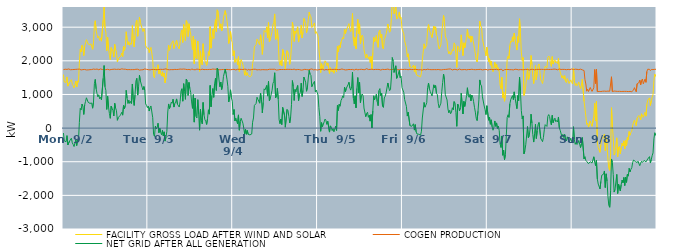
| Category | FACILITY GROSS LOAD AFTER WIND AND SOLAR | COGEN PRODUCTION | NET GRID AFTER ALL GENERATION |
|---|---|---|---|
|  Mon  9/2 | 1591 | 1738 | -147 |
|  Mon  9/2 | 1369 | 1754 | -385 |
|  Mon  9/2 | 1376 | 1750 | -374 |
|  Mon  9/2 | 1357 | 1762 | -405 |
|  Mon  9/2 | 1521 | 1745 | -224 |
|  Mon  9/2 | 1248 | 1750 | -502 |
|  Mon  9/2 | 1271 | 1758 | -487 |
|  Mon  9/2 | 1366 | 1748 | -382 |
|  Mon  9/2 | 1382 | 1735 | -353 |
|  Mon  9/2 | 1440 | 1741 | -301 |
|  Mon  9/2 | 1302 | 1739 | -437 |
|  Mon  9/2 | 1262 | 1747 | -485 |
|  Mon  9/2 | 1193 | 1742 | -549 |
|  Mon  9/2 | 1191 | 1741 | -550 |
|  Mon  9/2 | 1399 | 1746 | -347 |
|  Mon  9/2 | 1221 | 1739 | -518 |
|  Mon  9/2 | 1403 | 1750 | -347 |
|  Mon  9/2 | 1361 | 1741 | -380 |
|  Mon  9/2 | 1919 | 1753 | 166 |
|  Mon  9/2 | 2342 | 1755 | 587 |
|  Mon  9/2 | 2266 | 1729 | 537 |
|  Mon  9/2 | 2459 | 1745 | 714 |
|  Mon  9/2 | 2384 | 1739 | 645 |
|  Mon  9/2 | 2156 | 1750 | 406 |
|  Mon  9/2 | 2431 | 1743 | 688 |
|  Mon  9/2 | 2539 | 1744 | 795 |
|  Mon  9/2 | 2630 | 1729 | 901 |
|  Mon  9/2 | 2621 | 1745 | 876 |
|  Mon  9/2 | 2496 | 1731 | 765 |
|  Mon  9/2 | 2506 | 1748 | 758 |
|  Mon  9/2 | 2472 | 1737 | 735 |
|  Mon  9/2 | 2506 | 1742 | 764 |
|  Mon  9/2 | 2485 | 1740 | 745 |
|  Mon  9/2 | 2342 | 1751 | 591 |
|  Mon  9/2 | 2525 | 1755 | 770 |
|  Mon  9/2 | 3078 | 1757 | 1321 |
|  Mon  9/2 | 3192 | 1746 | 1446 |
|  Mon  9/2 | 2906 | 1740 | 1166 |
|  Mon  9/2 | 2779 | 1755 | 1024 |
|  Mon  9/2 | 2678 | 1751 | 927 |
|  Mon  9/2 | 2728 | 1734 | 994 |
|  Mon  9/2 | 2608 | 1738 | 870 |
|  Mon  9/2 | 2679 | 1760 | 919 |
|  Mon  9/2 | 2584 | 1742 | 842 |
|  Mon  9/2 | 2562 | 1741 | 821 |
|  Mon  9/2 | 3211 | 1728 | 1483 |
|  Mon  9/2 | 3599 | 1740 | 1859 |
|  Mon  9/2 | 2968 | 1742 | 1226 |
|  Mon  9/2 | 2856 | 1736 | 1120 |
|  Mon  9/2 | 2301 | 1746 | 555 |
|  Mon  9/2 | 2694 | 1749 | 945 |
|  Mon  9/2 | 2364 | 1738 | 626 |
|  Mon  9/2 | 2165 | 1731 | 434 |
|  Mon  9/2 | 2031 | 1740 | 291 |
|  Mon  9/2 | 2393 | 1741 | 652 |
|  Mon  9/2 | 2325 | 1741 | 584 |
|  Mon  9/2 | 2278 | 1748 | 530 |
|  Mon  9/2 | 2110 | 1751 | 359 |
|  Mon  9/2 | 2490 | 1752 | 738 |
|  Mon  9/2 | 2346 | 1749 | 597 |
|  Mon  9/2 | 2258 | 1744 | 514 |
|  Mon  9/2 | 1964 | 1732 | 232 |
|  Mon  9/2 | 2066 | 1751 | 315 |
|  Mon  9/2 | 2066 | 1746 | 320 |
|  Mon  9/2 | 2111 | 1742 | 369 |
|  Mon  9/2 | 2147 | 1733 | 414 |
|  Mon  9/2 | 2233 | 1762 | 471 |
|  Mon  9/2 | 2126 | 1742 | 384 |
|  Mon  9/2 | 2426 | 1751 | 675 |
|  Mon  9/2 | 2313 | 1740 | 573 |
|  Mon  9/2 | 2427 | 1751 | 676 |
|  Mon  9/2 | 2864 | 1742 | 1122 |
|  Mon  9/2 | 2625 | 1737 | 888 |
|  Mon  9/2 | 2480 | 1747 | 733 |
|  Mon  9/2 | 2568 | 1740 | 828 |
|  Mon  9/2 | 2459 | 1726 | 733 |
|  Mon  9/2 | 2531 | 1737 | 794 |
|  Mon  9/2 | 2490 | 1759 | 731 |
|  Mon  9/2 | 3050 | 1739 | 1311 |
|  Mon  9/2 | 2584 | 1741 | 843 |
|  Mon  9/2 | 2411 | 1738 | 673 |
|  Mon  9/2 | 2742 | 1749 | 993 |
|  Mon  9/2 | 3147 | 1748 | 1399 |
|  Mon  9/2 | 3208 | 1729 | 1479 |
|  Mon  9/2 | 2730 | 1749 | 981 |
|  Mon  9/2 | 2977 | 1742 | 1235 |
|  Mon  9/2 | 3298 | 1725 | 1573 |
|  Mon  9/2 | 3141 | 1737 | 1404 |
|  Mon  9/2 | 3127 | 1732 | 1395 |
|  Mon  9/2 | 2957 | 1741 | 1216 |
|  Mon  9/2 | 2868 | 1734 | 1134 |
|  Mon  9/2 | 2964 | 1727 | 1237 |
|  Mon  9/2 | 2882 | 1759 | 1123 |
|  Mon  9/2 | 2453 | 1735 | 718 |
|  Mon  9/2 | 2426 | 1747 | 679 |
|  Mon  9/2 | 2358 | 1750 | 608 |
|  Tue  9/3 | 2392 | 1737 | 655 |
|  Tue  9/3 | 2246 | 1739 | 507 |
|  Tue  9/3 | 2341 | 1731 | 610 |
|  Tue  9/3 | 2400 | 1742 | 658 |
|  Tue  9/3 | 2406 | 1743 | 663 |
|  Tue  9/3 | 2041 | 1732 | 309 |
|  Tue  9/3 | 1551 | 1743 | -192 |
|  Tue  9/3 | 1496 | 1742 | -246 |
|  Tue  9/3 | 1801 | 1741 | 60 |
|  Tue  9/3 | 1715 | 1739 | -24 |
|  Tue  9/3 | 1746 | 1735 | 11 |
|  Tue  9/3 | 1883 | 1739 | 144 |
|  Tue  9/3 | 1606 | 1743 | -137 |
|  Tue  9/3 | 1736 | 1740 | -4 |
|  Tue  9/3 | 1626 | 1748 | -122 |
|  Tue  9/3 | 1547 | 1746 | -199 |
|  Tue  9/3 | 1676 | 1743 | -67 |
|  Tue  9/3 | 1524 | 1755 | -231 |
|  Tue  9/3 | 1637 | 1749 | -112 |
|  Tue  9/3 | 1345 | 1732 | -387 |
|  Tue  9/3 | 1495 | 1761 | -266 |
|  Tue  9/3 | 1656 | 1751 | -95 |
|  Tue  9/3 | 2217 | 1738 | 479 |
|  Tue  9/3 | 2467 | 1749 | 718 |
|  Tue  9/3 | 2314 | 1734 | 580 |
|  Tue  9/3 | 2413 | 1751 | 662 |
|  Tue  9/3 | 2510 | 1739 | 771 |
|  Tue  9/3 | 2482 | 1744 | 738 |
|  Tue  9/3 | 2596 | 1737 | 859 |
|  Tue  9/3 | 2363 | 1738 | 625 |
|  Tue  9/3 | 2474 | 1745 | 729 |
|  Tue  9/3 | 2531 | 1750 | 781 |
|  Tue  9/3 | 2609 | 1741 | 868 |
|  Tue  9/3 | 2452 | 1744 | 708 |
|  Tue  9/3 | 2429 | 1745 | 684 |
|  Tue  9/3 | 2356 | 1730 | 626 |
|  Tue  9/3 | 2545 | 1755 | 790 |
|  Tue  9/3 | 2841 | 1745 | 1096 |
|  Tue  9/3 | 2920 | 1750 | 1170 |
|  Tue  9/3 | 2547 | 1747 | 800 |
|  Tue  9/3 | 3077 | 1756 | 1321 |
|  Tue  9/3 | 2843 | 1747 | 1096 |
|  Tue  9/3 | 2604 | 1749 | 855 |
|  Tue  9/3 | 3195 | 1743 | 1452 |
|  Tue  9/3 | 3133 | 1738 | 1395 |
|  Tue  9/3 | 2720 | 1751 | 969 |
|  Tue  9/3 | 3102 | 1744 | 1358 |
|  Tue  9/3 | 2913 | 1740 | 1173 |
|  Tue  9/3 | 2785 | 1729 | 1056 |
|  Tue  9/3 | 2537 | 1760 | 777 |
|  Tue  9/3 | 2332 | 1745 | 587 |
|  Tue  9/3 | 2735 | 1740 | 995 |
|  Tue  9/3 | 1914 | 1737 | 177 |
|  Tue  9/3 | 2627 | 1733 | 894 |
|  Tue  9/3 | 2088 | 1740 | 348 |
|  Tue  9/3 | 2055 | 1754 | 301 |
|  Tue  9/3 | 2588 | 1743 | 845 |
|  Tue  9/3 | 2167 | 1746 | 421 |
|  Tue  9/3 | 1685 | 1748 | -63 |
|  Tue  9/3 | 2295 | 1736 | 559 |
|  Tue  9/3 | 1965 | 1742 | 223 |
|  Tue  9/3 | 1878 | 1752 | 126 |
|  Tue  9/3 | 2508 | 1746 | 762 |
|  Tue  9/3 | 2134 | 1738 | 396 |
|  Tue  9/3 | 2002 | 1749 | 253 |
|  Tue  9/3 | 1941 | 1741 | 200 |
|  Tue  9/3 | 1864 | 1756 | 108 |
|  Tue  9/3 | 2020 | 1740 | 280 |
|  Tue  9/3 | 2272 | 1728 | 544 |
|  Tue  9/3 | 2159 | 1745 | 414 |
|  Tue  9/3 | 3015 | 1746 | 1269 |
|  Tue  9/3 | 2375 | 1742 | 633 |
|  Tue  9/3 | 2706 | 1738 | 968 |
|  Tue  9/3 | 2931 | 1755 | 1176 |
|  Tue  9/3 | 2665 | 1750 | 915 |
|  Tue  9/3 | 3064 | 1750 | 1314 |
|  Tue  9/3 | 3224 | 1743 | 1481 |
|  Tue  9/3 | 2869 | 1748 | 1121 |
|  Tue  9/3 | 3515 | 1735 | 1780 |
|  Tue  9/3 | 3460 | 1742 | 1718 |
|  Tue  9/3 | 3176 | 1745 | 1431 |
|  Tue  9/3 | 2963 | 1733 | 1230 |
|  Tue  9/3 | 3099 | 1731 | 1368 |
|  Tue  9/3 | 2886 | 1740 | 1146 |
|  Tue  9/3 | 2998 | 1731 | 1267 |
|  Tue  9/3 | 3273 | 1742 | 1531 |
|  Tue  9/3 | 3297 | 1744 | 1553 |
|  Tue  9/3 | 3493 | 1742 | 1751 |
|  Tue  9/3 | 3362 | 1743 | 1619 |
|  Tue  9/3 | 3197 | 1744 | 1453 |
|  Tue  9/3 | 2979 | 1738 | 1241 |
|  Tue  9/3 | 2515 | 1739 | 776 |
|  Tue  9/3 | 2670 | 1745 | 925 |
|  Tue  9/3 | 2872 | 1734 | 1138 |
|  Tue  9/3 | 2635 | 1733 | 902 |
|  Tue  9/3 | 2543 | 1742 | 801 |
|  Wed  9/4 | 2151 | 1747 | 404 |
|  Wed  9/4 | 2299 | 1748 | 551 |
|  Wed  9/4 | 1956 | 1743 | 213 |
|  Wed  9/4 | 2022 | 1728 | 294 |
|  Wed  9/4 | 2062 | 1756 | 306 |
|  Wed  9/4 | 1876 | 1748 | 128 |
|  Wed  9/4 | 2128 | 1736 | 392 |
|  Wed  9/4 | 1683 | 1747 | -64 |
|  Wed  9/4 | 1943 | 1747 | 196 |
|  Wed  9/4 | 2039 | 1746 | 293 |
|  Wed  9/4 | 2065 | 1749 | 316 |
|  Wed  9/4 | 1888 | 1741 | 147 |
|  Wed  9/4 | 1746 | 1744 | 2 |
|  Wed  9/4 | 1574 | 1751 | -177 |
|  Wed  9/4 | 1713 | 1749 | -36 |
|  Wed  9/4 | 1563 | 1747 | -184 |
|  Wed  9/4 | 1645 | 1716 | -71 |
|  Wed  9/4 | 1563 | 1749 | -186 |
|  Wed  9/4 | 1554 | 1757 | -203 |
|  Wed  9/4 | 1524 | 1727 | -203 |
|  Wed  9/4 | 1537 | 1749 | -212 |
|  Wed  9/4 | 1568 | 1742 | -174 |
|  Wed  9/4 | 1922 | 1748 | 174 |
|  Wed  9/4 | 2049 | 1748 | 301 |
|  Wed  9/4 | 2415 | 1742 | 673 |
|  Wed  9/4 | 2432 | 1750 | 682 |
|  Wed  9/4 | 2485 | 1751 | 734 |
|  Wed  9/4 | 2647 | 1729 | 918 |
|  Wed  9/4 | 2590 | 1734 | 856 |
|  Wed  9/4 | 2600 | 1737 | 863 |
|  Wed  9/4 | 2478 | 1738 | 740 |
|  Wed  9/4 | 2774 | 1731 | 1043 |
|  Wed  9/4 | 2593 | 1749 | 844 |
|  Wed  9/4 | 2191 | 1738 | 453 |
|  Wed  9/4 | 2499 | 1734 | 765 |
|  Wed  9/4 | 2903 | 1736 | 1167 |
|  Wed  9/4 | 2880 | 1746 | 1134 |
|  Wed  9/4 | 2849 | 1734 | 1115 |
|  Wed  9/4 | 3010 | 1742 | 1268 |
|  Wed  9/4 | 2685 | 1734 | 951 |
|  Wed  9/4 | 3138 | 1752 | 1386 |
|  Wed  9/4 | 2562 | 1749 | 813 |
|  Wed  9/4 | 2630 | 1745 | 885 |
|  Wed  9/4 | 2635 | 1748 | 887 |
|  Wed  9/4 | 2866 | 1743 | 1123 |
|  Wed  9/4 | 3075 | 1748 | 1327 |
|  Wed  9/4 | 3143 | 1753 | 1390 |
|  Wed  9/4 | 3394 | 1749 | 1645 |
|  Wed  9/4 | 2633 | 1734 | 899 |
|  Wed  9/4 | 2675 | 1725 | 950 |
|  Wed  9/4 | 2927 | 1744 | 1183 |
|  Wed  9/4 | 2592 | 1732 | 860 |
|  Wed  9/4 | 1988 | 1741 | 247 |
|  Wed  9/4 | 1872 | 1741 | 131 |
|  Wed  9/4 | 2006 | 1739 | 267 |
|  Wed  9/4 | 1847 | 1742 | 105 |
|  Wed  9/4 | 2337 | 1722 | 615 |
|  Wed  9/4 | 2337 | 1742 | 595 |
|  Wed  9/4 | 2137 | 1747 | 390 |
|  Wed  9/4 | 1766 | 1740 | 26 |
|  Wed  9/4 | 1784 | 1748 | 36 |
|  Wed  9/4 | 2302 | 1748 | 554 |
|  Wed  9/4 | 2261 | 1738 | 523 |
|  Wed  9/4 | 2096 | 1746 | 350 |
|  Wed  9/4 | 1894 | 1741 | 153 |
|  Wed  9/4 | 2073 | 1746 | 327 |
|  Wed  9/4 | 2441 | 1745 | 696 |
|  Wed  9/4 | 3154 | 1741 | 1413 |
|  Wed  9/4 | 2985 | 1751 | 1234 |
|  Wed  9/4 | 2574 | 1753 | 821 |
|  Wed  9/4 | 2888 | 1741 | 1147 |
|  Wed  9/4 | 2814 | 1732 | 1082 |
|  Wed  9/4 | 2929 | 1731 | 1198 |
|  Wed  9/4 | 3012 | 1744 | 1268 |
|  Wed  9/4 | 2558 | 1744 | 814 |
|  Wed  9/4 | 2742 | 1740 | 1002 |
|  Wed  9/4 | 2803 | 1743 | 1060 |
|  Wed  9/4 | 3059 | 1724 | 1335 |
|  Wed  9/4 | 2678 | 1737 | 941 |
|  Wed  9/4 | 2852 | 1731 | 1121 |
|  Wed  9/4 | 3262 | 1746 | 1516 |
|  Wed  9/4 | 3187 | 1747 | 1440 |
|  Wed  9/4 | 3104 | 1739 | 1365 |
|  Wed  9/4 | 2834 | 1739 | 1095 |
|  Wed  9/4 | 2954 | 1739 | 1215 |
|  Wed  9/4 | 3222 | 1732 | 1490 |
|  Wed  9/4 | 3446 | 1729 | 1717 |
|  Wed  9/4 | 3344 | 1746 | 1598 |
|  Wed  9/4 | 3308 | 1744 | 1564 |
|  Wed  9/4 | 2990 | 1759 | 1231 |
|  Wed  9/4 | 3029 | 1733 | 1296 |
|  Wed  9/4 | 3013 | 1731 | 1282 |
|  Wed  9/4 | 3127 | 1738 | 1389 |
|  Wed  9/4 | 2814 | 1739 | 1075 |
|  Wed  9/4 | 2868 | 1738 | 1130 |
|  Wed  9/4 | 2860 | 1726 | 1134 |
|  Thu  9/5 | 2737 | 1750 | 987 |
|  Thu  9/5 | 2345 | 1737 | 608 |
|  Thu  9/5 | 2076 | 1738 | 338 |
|  Thu  9/5 | 1650 | 1745 | -95 |
|  Thu  9/5 | 1915 | 1752 | 163 |
|  Thu  9/5 | 1787 | 1749 | 38 |
|  Thu  9/5 | 1750 | 1739 | 11 |
|  Thu  9/5 | 1914 | 1726 | 188 |
|  Thu  9/5 | 2000 | 1732 | 268 |
|  Thu  9/5 | 1964 | 1741 | 223 |
|  Thu  9/5 | 1852 | 1740 | 112 |
|  Thu  9/5 | 1935 | 1733 | 202 |
|  Thu  9/5 | 1922 | 1740 | 182 |
|  Thu  9/5 | 1627 | 1746 | -119 |
|  Thu  9/5 | 1797 | 1730 | 67 |
|  Thu  9/5 | 1773 | 1745 | 28 |
|  Thu  9/5 | 1667 | 1742 | -75 |
|  Thu  9/5 | 1734 | 1745 | -11 |
|  Thu  9/5 | 1627 | 1739 | -112 |
|  Thu  9/5 | 1648 | 1746 | -98 |
|  Thu  9/5 | 1796 | 1739 | 57 |
|  Thu  9/5 | 1675 | 1744 | -69 |
|  Thu  9/5 | 2426 | 1751 | 675 |
|  Thu  9/5 | 2263 | 1739 | 524 |
|  Thu  9/5 | 2458 | 1746 | 712 |
|  Thu  9/5 | 2390 | 1741 | 649 |
|  Thu  9/5 | 2560 | 1745 | 815 |
|  Thu  9/5 | 2632 | 1758 | 874 |
|  Thu  9/5 | 2692 | 1734 | 958 |
|  Thu  9/5 | 2650 | 1742 | 908 |
|  Thu  9/5 | 2946 | 1727 | 1219 |
|  Thu  9/5 | 2811 | 1729 | 1082 |
|  Thu  9/5 | 2915 | 1732 | 1183 |
|  Thu  9/5 | 2914 | 1734 | 1180 |
|  Thu  9/5 | 3042 | 1750 | 1292 |
|  Thu  9/5 | 3105 | 1743 | 1362 |
|  Thu  9/5 | 2940 | 1743 | 1197 |
|  Thu  9/5 | 2869 | 1740 | 1129 |
|  Thu  9/5 | 2967 | 1743 | 1224 |
|  Thu  9/5 | 3407 | 1744 | 1663 |
|  Thu  9/5 | 2639 | 1750 | 889 |
|  Thu  9/5 | 2448 | 1727 | 721 |
|  Thu  9/5 | 2695 | 1736 | 959 |
|  Thu  9/5 | 2355 | 1752 | 603 |
|  Thu  9/5 | 2921 | 1739 | 1182 |
|  Thu  9/5 | 3236 | 1733 | 1503 |
|  Thu  9/5 | 2811 | 1760 | 1051 |
|  Thu  9/5 | 3101 | 1743 | 1358 |
|  Thu  9/5 | 2501 | 1743 | 758 |
|  Thu  9/5 | 2709 | 1748 | 961 |
|  Thu  9/5 | 2766 | 1753 | 1013 |
|  Thu  9/5 | 2695 | 1739 | 956 |
|  Thu  9/5 | 2333 | 1735 | 598 |
|  Thu  9/5 | 2324 | 1738 | 586 |
|  Thu  9/5 | 2080 | 1740 | 340 |
|  Thu  9/5 | 2199 | 1766 | 433 |
|  Thu  9/5 | 2222 | 1750 | 472 |
|  Thu  9/5 | 2061 | 1741 | 320 |
|  Thu  9/5 | 2123 | 1735 | 388 |
|  Thu  9/5 | 1951 | 1744 | 207 |
|  Thu  9/5 | 2131 | 1729 | 402 |
|  Thu  9/5 | 1755 | 1751 | 4 |
|  Thu  9/5 | 2246 | 1733 | 513 |
|  Thu  9/5 | 2698 | 1738 | 960 |
|  Thu  9/5 | 2568 | 1728 | 840 |
|  Thu  9/5 | 2656 | 1745 | 911 |
|  Thu  9/5 | 2750 | 1746 | 1004 |
|  Thu  9/5 | 2530 | 1745 | 785 |
|  Thu  9/5 | 2400 | 1734 | 666 |
|  Thu  9/5 | 2859 | 1744 | 1115 |
|  Thu  9/5 | 2916 | 1742 | 1174 |
|  Thu  9/5 | 2686 | 1726 | 960 |
|  Thu  9/5 | 2783 | 1751 | 1032 |
|  Thu  9/5 | 2397 | 1747 | 650 |
|  Thu  9/5 | 2351 | 1738 | 613 |
|  Thu  9/5 | 2637 | 1741 | 896 |
|  Thu  9/5 | 2700 | 1751 | 949 |
|  Thu  9/5 | 2789 | 1744 | 1045 |
|  Thu  9/5 | 2763 | 1721 | 1042 |
|  Thu  9/5 | 3095 | 1754 | 1341 |
|  Thu  9/5 | 2950 | 1742 | 1208 |
|  Thu  9/5 | 2849 | 1736 | 1113 |
|  Thu  9/5 | 2890 | 1747 | 1143 |
|  Thu  9/5 | 3262 | 1743 | 1519 |
|  Thu  9/5 | 3851 | 1754 | 2097 |
|  Thu  9/5 | 3737 | 1744 | 1993 |
|  Thu  9/5 | 3402 | 1748 | 1654 |
|  Thu  9/5 | 3514 | 1751 | 1763 |
|  Thu  9/5 | 3601 | 1748 | 1853 |
|  Thu  9/5 | 3240 | 1761 | 1479 |
|  Thu  9/5 | 3274 | 1730 | 1544 |
|  Thu  9/5 | 3254 | 1728 | 1526 |
|  Thu  9/5 | 3452 | 1737 | 1715 |
|  Thu  9/5 | 3253 | 1756 | 1497 |
|  Thu  9/5 | 3291 | 1749 | 1542 |
|  Thu  9/5 | 2956 | 1754 | 1202 |
|  Fri  9/6 | 2947 | 1740 | 1207 |
|  Fri  9/6 | 2805 | 1742 | 1063 |
|  Fri  9/6 | 2596 | 1747 | 849 |
|  Fri  9/6 | 2586 | 1747 | 839 |
|  Fri  9/6 | 2389 | 1744 | 645 |
|  Fri  9/6 | 2111 | 1754 | 357 |
|  Fri  9/6 | 2209 | 1736 | 473 |
|  Fri  9/6 | 2183 | 1738 | 445 |
|  Fri  9/6 | 1822 | 1749 | 73 |
|  Fri  9/6 | 1839 | 1740 | 99 |
|  Fri  9/6 | 1793 | 1740 | 53 |
|  Fri  9/6 | 1781 | 1741 | 40 |
|  Fri  9/6 | 1871 | 1742 | 129 |
|  Fri  9/6 | 1679 | 1739 | -60 |
|  Fri  9/6 | 1851 | 1748 | 103 |
|  Fri  9/6 | 1618 | 1730 | -112 |
|  Fri  9/6 | 1563 | 1740 | -177 |
|  Fri  9/6 | 1546 | 1745 | -199 |
|  Fri  9/6 | 1549 | 1733 | -184 |
|  Fri  9/6 | 1549 | 1740 | -191 |
|  Fri  9/6 | 1524 | 1736 | -212 |
|  Fri  9/6 | 1645 | 1738 | -93 |
|  Fri  9/6 | 2026 | 1726 | 300 |
|  Fri  9/6 | 2026 | 1735 | 291 |
|  Fri  9/6 | 2504 | 1743 | 761 |
|  Fri  9/6 | 2368 | 1747 | 621 |
|  Fri  9/6 | 2415 | 1734 | 681 |
|  Fri  9/6 | 2487 | 1733 | 754 |
|  Fri  9/6 | 2954 | 1752 | 1202 |
|  Fri  9/6 | 3077 | 1738 | 1339 |
|  Fri  9/6 | 2910 | 1741 | 1169 |
|  Fri  9/6 | 2844 | 1757 | 1087 |
|  Fri  9/6 | 2822 | 1737 | 1085 |
|  Fri  9/6 | 2690 | 1737 | 953 |
|  Fri  9/6 | 2684 | 1738 | 946 |
|  Fri  9/6 | 3031 | 1745 | 1286 |
|  Fri  9/6 | 2936 | 1739 | 1197 |
|  Fri  9/6 | 3011 | 1745 | 1266 |
|  Fri  9/6 | 2766 | 1737 | 1029 |
|  Fri  9/6 | 2728 | 1733 | 995 |
|  Fri  9/6 | 2483 | 1743 | 740 |
|  Fri  9/6 | 2351 | 1748 | 603 |
|  Fri  9/6 | 2344 | 1733 | 611 |
|  Fri  9/6 | 2474 | 1733 | 741 |
|  Fri  9/6 | 2812 | 1732 | 1080 |
|  Fri  9/6 | 3094 | 1744 | 1350 |
|  Fri  9/6 | 3349 | 1742 | 1607 |
|  Fri  9/6 | 3180 | 1744 | 1436 |
|  Fri  9/6 | 2738 | 1743 | 995 |
|  Fri  9/6 | 2742 | 1751 | 991 |
|  Fri  9/6 | 2584 | 1748 | 836 |
|  Fri  9/6 | 2309 | 1740 | 569 |
|  Fri  9/6 | 2207 | 1756 | 451 |
|  Fri  9/6 | 2276 | 1746 | 530 |
|  Fri  9/6 | 2183 | 1757 | 426 |
|  Fri  9/6 | 2222 | 1747 | 475 |
|  Fri  9/6 | 2335 | 1729 | 606 |
|  Fri  9/6 | 2293 | 1748 | 545 |
|  Fri  9/6 | 2534 | 1745 | 789 |
|  Fri  9/6 | 2489 | 1745 | 744 |
|  Fri  9/6 | 2210 | 1742 | 468 |
|  Fri  9/6 | 1804 | 1752 | 52 |
|  Fri  9/6 | 2442 | 1728 | 714 |
|  Fri  9/6 | 2400 | 1754 | 646 |
|  Fri  9/6 | 2267 | 1756 | 511 |
|  Fri  9/6 | 2335 | 1736 | 599 |
|  Fri  9/6 | 2772 | 1735 | 1037 |
|  Fri  9/6 | 2766 | 1747 | 1019 |
|  Fri  9/6 | 2158 | 1737 | 421 |
|  Fri  9/6 | 2536 | 1741 | 795 |
|  Fri  9/6 | 2385 | 1742 | 643 |
|  Fri  9/6 | 2526 | 1744 | 782 |
|  Fri  9/6 | 2695 | 1732 | 963 |
|  Fri  9/6 | 2939 | 1740 | 1199 |
|  Fri  9/6 | 2704 | 1742 | 962 |
|  Fri  9/6 | 2662 | 1748 | 914 |
|  Fri  9/6 | 2742 | 1741 | 1001 |
|  Fri  9/6 | 2555 | 1746 | 809 |
|  Fri  9/6 | 2733 | 1749 | 984 |
|  Fri  9/6 | 2660 | 1739 | 921 |
|  Fri  9/6 | 2530 | 1740 | 790 |
|  Fri  9/6 | 2362 | 1743 | 619 |
|  Fri  9/6 | 2210 | 1736 | 474 |
|  Fri  9/6 | 2034 | 1745 | 289 |
|  Fri  9/6 | 1964 | 1740 | 224 |
|  Fri  9/6 | 2238 | 1737 | 501 |
|  Fri  9/6 | 2586 | 1743 | 843 |
|  Fri  9/6 | 3181 | 1749 | 1432 |
|  Fri  9/6 | 3039 | 1746 | 1293 |
|  Fri  9/6 | 3003 | 1748 | 1255 |
|  Fri  9/6 | 2659 | 1730 | 929 |
|  Fri  9/6 | 2648 | 1745 | 903 |
|  Fri  9/6 | 2395 | 1738 | 657 |
|  Fri  9/6 | 2294 | 1744 | 550 |
|  Fri  9/6 | 2148 | 1746 | 402 |
|  Fri  9/6 | 2405 | 1740 | 665 |
|  Sat  9/7 | 2392 | 1726 | 666 |
|  Sat  9/7 | 1974 | 1740 | 234 |
|  Sat  9/7 | 2068 | 1741 | 327 |
|  Sat  9/7 | 1870 | 1756 | 114 |
|  Sat  9/7 | 1990 | 1744 | 246 |
|  Sat  9/7 | 1768 | 1730 | 38 |
|  Sat  9/7 | 1674 | 1738 | -64 |
|  Sat  9/7 | 1769 | 1742 | 27 |
|  Sat  9/7 | 1953 | 1741 | 212 |
|  Sat  9/7 | 1795 | 1742 | 53 |
|  Sat  9/7 | 1901 | 1747 | 154 |
|  Sat  9/7 | 1724 | 1734 | -10 |
|  Sat  9/7 | 1793 | 1734 | 59 |
|  Sat  9/7 | 1668 | 1744 | -76 |
|  Sat  9/7 | 1278 | 1745 | -467 |
|  Sat  9/7 | 1171 | 1748 | -577 |
|  Sat  9/7 | 1512 | 1746 | -234 |
|  Sat  9/7 | 896 | 1704 | -808 |
|  Sat  9/7 | 1076 | 1732 | -656 |
|  Sat  9/7 | 799 | 1738 | -939 |
|  Sat  9/7 | 965 | 1751 | -786 |
|  Sat  9/7 | 1506 | 1742 | -236 |
|  Sat  9/7 | 2045 | 1727 | 318 |
|  Sat  9/7 | 2140 | 1743 | 397 |
|  Sat  9/7 | 2069 | 1751 | 318 |
|  Sat  9/7 | 2452 | 1736 | 716 |
|  Sat  9/7 | 2589 | 1744 | 845 |
|  Sat  9/7 | 2553 | 1737 | 816 |
|  Sat  9/7 | 2713 | 1748 | 965 |
|  Sat  9/7 | 2576 | 1729 | 847 |
|  Sat  9/7 | 2824 | 1747 | 1077 |
|  Sat  9/7 | 2640 | 1750 | 890 |
|  Sat  9/7 | 2457 | 1732 | 725 |
|  Sat  9/7 | 2320 | 1743 | 577 |
|  Sat  9/7 | 2723 | 1756 | 967 |
|  Sat  9/7 | 2548 | 1731 | 817 |
|  Sat  9/7 | 3250 | 1738 | 1512 |
|  Sat  9/7 | 2845 | 1740 | 1105 |
|  Sat  9/7 | 2258 | 1738 | 520 |
|  Sat  9/7 | 2013 | 1735 | 278 |
|  Sat  9/7 | 2097 | 1735 | 362 |
|  Sat  9/7 | 971 | 1735 | -764 |
|  Sat  9/7 | 1068 | 1746 | -678 |
|  Sat  9/7 | 1249 | 1746 | -497 |
|  Sat  9/7 | 1257 | 1737 | -480 |
|  Sat  9/7 | 1787 | 1742 | 45 |
|  Sat  9/7 | 1448 | 1730 | -282 |
|  Sat  9/7 | 1507 | 1728 | -221 |
|  Sat  9/7 | 1753 | 1751 | 2 |
|  Sat  9/7 | 2158 | 1745 | 413 |
|  Sat  9/7 | 1892 | 1745 | 147 |
|  Sat  9/7 | 1550 | 1746 | -196 |
|  Sat  9/7 | 1324 | 1739 | -415 |
|  Sat  9/7 | 1567 | 1732 | -165 |
|  Sat  9/7 | 1855 | 1742 | 113 |
|  Sat  9/7 | 1435 | 1744 | -309 |
|  Sat  9/7 | 1679 | 1754 | -75 |
|  Sat  9/7 | 1852 | 1745 | 107 |
|  Sat  9/7 | 1907 | 1740 | 167 |
|  Sat  9/7 | 1935 | 1745 | 190 |
|  Sat  9/7 | 1439 | 1748 | -309 |
|  Sat  9/7 | 1394 | 1747 | -353 |
|  Sat  9/7 | 1326 | 1730 | -404 |
|  Sat  9/7 | 1461 | 1744 | -283 |
|  Sat  9/7 | 1694 | 1743 | -49 |
|  Sat  9/7 | 1838 | 1736 | 102 |
|  Sat  9/7 | 1831 | 1727 | 104 |
|  Sat  9/7 | 1797 | 1748 | 49 |
|  Sat  9/7 | 2091 | 1740 | 351 |
|  Sat  9/7 | 2143 | 1741 | 402 |
|  Sat  9/7 | 2097 | 1753 | 344 |
|  Sat  9/7 | 1916 | 1744 | 172 |
|  Sat  9/7 | 1835 | 1738 | 97 |
|  Sat  9/7 | 2125 | 1746 | 379 |
|  Sat  9/7 | 1904 | 1742 | 162 |
|  Sat  9/7 | 1997 | 1754 | 243 |
|  Sat  9/7 | 2031 | 1736 | 295 |
|  Sat  9/7 | 1939 | 1749 | 190 |
|  Sat  9/7 | 1972 | 1748 | 224 |
|  Sat  9/7 | 1916 | 1733 | 183 |
|  Sat  9/7 | 2080 | 1750 | 330 |
|  Sat  9/7 | 1764 | 1757 | 7 |
|  Sat  9/7 | 1666 | 1734 | -68 |
|  Sat  9/7 | 1685 | 1743 | -58 |
|  Sat  9/7 | 1488 | 1750 | -262 |
|  Sat  9/7 | 1560 | 1746 | -186 |
|  Sat  9/7 | 1458 | 1739 | -281 |
|  Sat  9/7 | 1557 | 1744 | -187 |
|  Sat  9/7 | 1392 | 1737 | -345 |
|  Sat  9/7 | 1352 | 1736 | -384 |
|  Sat  9/7 | 1473 | 1732 | -259 |
|  Sat  9/7 | 1409 | 1746 | -337 |
|  Sat  9/7 | 1326 | 1743 | -417 |
|  Sat  9/7 | 1371 | 1738 | -367 |
|  Sat  9/7 | 1434 | 1736 | -302 |
|  Sat  9/7 | 1351 | 1757 | -406 |
|  Sun  9/8 | 1310 | 1750 | -440 |
|  Sun  9/8 | 1782 | 1741 | 41 |
|  Sun  9/8 | 1414 | 1753 | -339 |
|  Sun  9/8 | 1267 | 1750 | -483 |
|  Sun  9/8 | 1328 | 1750 | -422 |
|  Sun  9/8 | 1258 | 1747 | -489 |
|  Sun  9/8 | 1295 | 1744 | -449 |
|  Sun  9/8 | 1371 | 1738 | -367 |
|  Sun  9/8 | 1260 | 1735 | -475 |
|  Sun  9/8 | 1173 | 1752 | -579 |
|  Sun  9/8 | 1277 | 1742 | -465 |
|  Sun  9/8 | 1452 | 1731 | -279 |
|  Sun  9/8 | 1458 | 1738 | -280 |
|  Sun  9/8 | 794 | 1710 | -916 |
|  Sun  9/8 | 585 | 1437 | -852 |
|  Sun  9/8 | 351 | 1312 | -961 |
|  Sun  9/8 | 106 | 1097 | -991 |
|  Sun  9/8 | 149 | 1155 | -1006 |
|  Sun  9/8 | 29 | 1088 | -1059 |
|  Sun  9/8 | 55 | 1089 | -1034 |
|  Sun  9/8 | 205 | 1206 | -1001 |
|  Sun  9/8 | 129 | 1146 | -1017 |
|  Sun  9/8 | 52 | 1091 | -1039 |
|  Sun  9/8 | 72 | 1096 | -1024 |
|  Sun  9/8 | 345 | 1198 | -853 |
|  Sun  9/8 | 736 | 1740 | -1004 |
|  Sun  9/8 | 212 | 1327 | -1115 |
|  Sun  9/8 | 791 | 1745 | -954 |
|  Sun  9/8 | -431 | 1085 | -1516 |
|  Sun  9/8 | -587 | 1076 | -1663 |
|  Sun  9/8 | -597 | 1091 | -1688 |
|  Sun  9/8 | -721 | 1088 | -1809 |
|  Sun  9/8 | -498 | 1087 | -1585 |
|  Sun  9/8 | -306 | 1095 | -1401 |
|  Sun  9/8 | -323 | 1096 | -1419 |
|  Sun  9/8 | -280 | 1091 | -1371 |
|  Sun  9/8 | -176 | 1099 | -1275 |
|  Sun  9/8 | -670 | 1098 | -1768 |
|  Sun  9/8 | -266 | 1093 | -1359 |
|  Sun  9/8 | -492 | 1085 | -1577 |
|  Sun  9/8 | -935 | 1100 | -2035 |
|  Sun  9/8 | -1198 | 1102 | -2300 |
|  Sun  9/8 | -1260 | 1094 | -2354 |
|  Sun  9/8 | -769 | 1095 | -1864 |
|  Sun  9/8 | 607 | 1525 | -918 |
|  Sun  9/8 | 67 | 1085 | -1018 |
|  Sun  9/8 | -284 | 1097 | -1381 |
|  Sun  9/8 | -801 | 1101 | -1902 |
|  Sun  9/8 | -728 | 1098 | -1826 |
|  Sun  9/8 | -725 | 1096 | -1821 |
|  Sun  9/8 | -289 | 1088 | -1377 |
|  Sun  9/8 | -853 | 1091 | -1944 |
|  Sun  9/8 | -580 | 1084 | -1664 |
|  Sun  9/8 | -546 | 1093 | -1639 |
|  Sun  9/8 | -764 | 1101 | -1865 |
|  Sun  9/8 | -591 | 1088 | -1679 |
|  Sun  9/8 | -447 | 1097 | -1544 |
|  Sun  9/8 | -534 | 1091 | -1625 |
|  Sun  9/8 | -380 | 1089 | -1469 |
|  Sun  9/8 | -616 | 1092 | -1708 |
|  Sun  9/8 | -366 | 1090 | -1456 |
|  Sun  9/8 | -523 | 1091 | -1614 |
|  Sun  9/8 | -278 | 1094 | -1372 |
|  Sun  9/8 | -345 | 1086 | -1431 |
|  Sun  9/8 | -104 | 1092 | -1196 |
|  Sun  9/8 | -212 | 1091 | -1303 |
|  Sun  9/8 | -130 | 1094 | -1224 |
|  Sun  9/8 | -92 | 1083 | -1175 |
|  Sun  9/8 | 79 | 1097 | -1018 |
|  Sun  9/8 | 178 | 1130 | -952 |
|  Sun  9/8 | 236 | 1202 | -966 |
|  Sun  9/8 | 230 | 1224 | -994 |
|  Sun  9/8 | 69 | 1080 | -1011 |
|  Sun  9/8 | 291 | 1317 | -1026 |
|  Sun  9/8 | 338 | 1322 | -984 |
|  Sun  9/8 | 375 | 1351 | -976 |
|  Sun  9/8 | 311 | 1428 | -1117 |
|  Sun  9/8 | 244 | 1288 | -1044 |
|  Sun  9/8 | 425 | 1411 | -986 |
|  Sun  9/8 | 439 | 1459 | -1020 |
|  Sun  9/8 | 320 | 1317 | -997 |
|  Sun  9/8 | 339 | 1300 | -961 |
|  Sun  9/8 | 471 | 1457 | -986 |
|  Sun  9/8 | 354 | 1360 | -1006 |
|  Sun  9/8 | 701 | 1681 | -980 |
|  Sun  9/8 | 831 | 1750 | -919 |
|  Sun  9/8 | 818 | 1745 | -927 |
|  Sun  9/8 | 899 | 1747 | -848 |
|  Sun  9/8 | 670 | 1709 | -1039 |
|  Sun  9/8 | 807 | 1741 | -934 |
|  Sun  9/8 | 916 | 1738 | -822 |
|  Sun  9/8 | 1002 | 1739 | -737 |
|  Sun  9/8 | 1418 | 1738 | -320 |
|  Sun  9/8 | 1609 | 1746 | -137 |
|  Sun  9/8 | 1591 | 1748 | -157 |
|  Sun  9/8 | 1497 | 1751 | -254 |